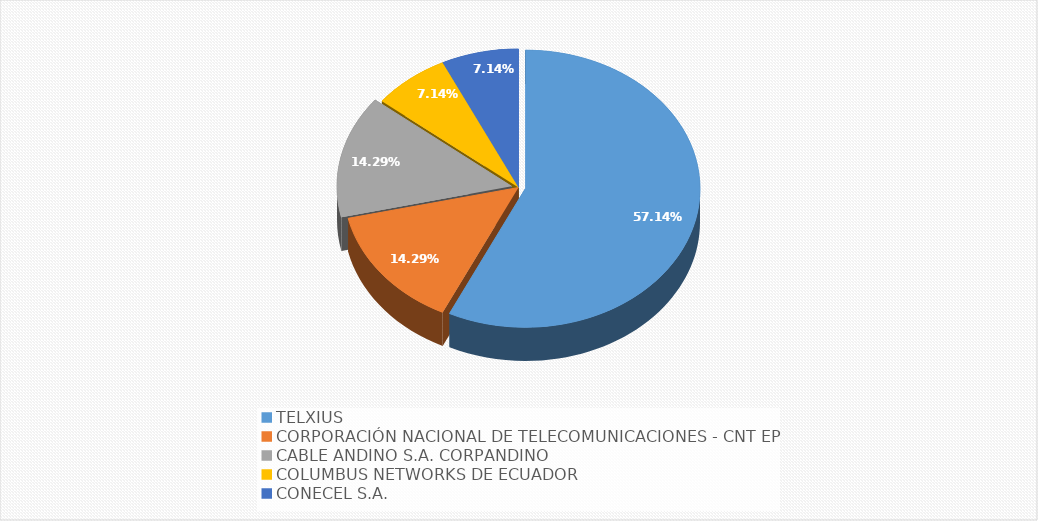
| Category | Series 0 |
|---|---|
| TELXIUS | 0.571 |
| CORPORACIÓN NACIONAL DE TELECOMUNICACIONES - CNT EP | 0.143 |
| CABLE ANDINO S.A. CORPANDINO | 0.143 |
| COLUMBUS NETWORKS DE ECUADOR | 0.071 |
| CONECEL S.A. | 0.071 |